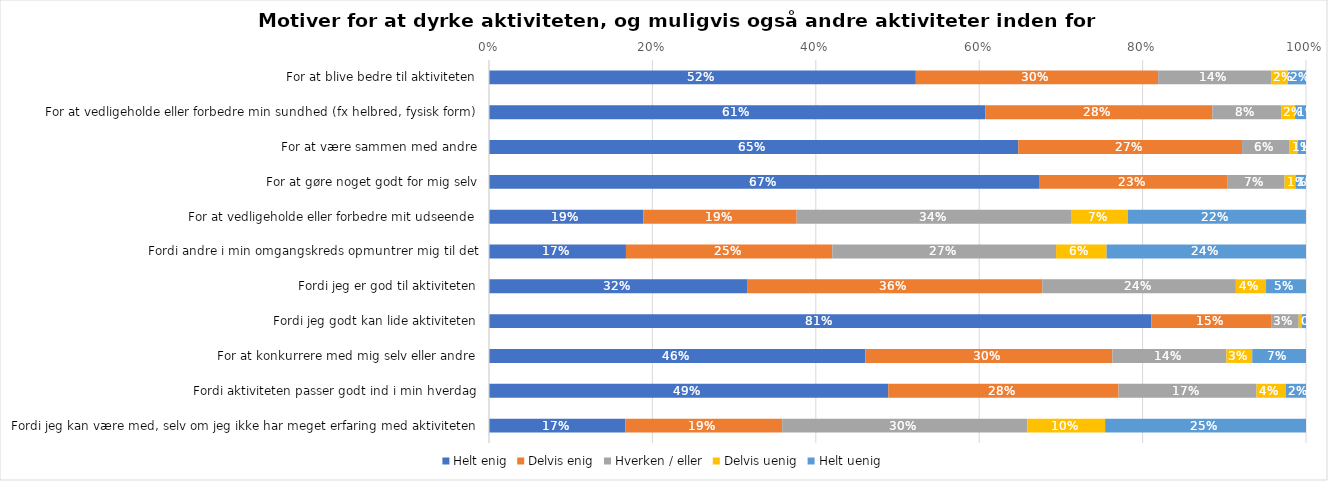
| Category | Helt enig | Delvis enig | Hverken / eller | Delvis uenig | Helt uenig |
|---|---|---|---|---|---|
| For at blive bedre til aktiviteten | 0.522 | 0.297 | 0.138 | 0.02 | 0.022 |
| For at vedligeholde eller forbedre min sundhed (fx helbred, fysisk form) | 0.607 | 0.278 | 0.084 | 0.017 | 0.013 |
| For at være sammen med andre | 0.648 | 0.274 | 0.058 | 0.01 | 0.01 |
| For at gøre noget godt for mig selv | 0.674 | 0.229 | 0.07 | 0.013 | 0.013 |
| For at vedligeholde eller forbedre mit udseende | 0.189 | 0.188 | 0.337 | 0.069 | 0.218 |
| Fordi andre i min omgangskreds opmuntrer mig til det | 0.168 | 0.253 | 0.274 | 0.062 | 0.244 |
| Fordi jeg er god til aktiviteten | 0.317 | 0.361 | 0.237 | 0.037 | 0.049 |
| Fordi jeg godt kan lide aktiviteten | 0.811 | 0.147 | 0.034 | 0.004 | 0.005 |
| For at konkurrere med mig selv eller andre | 0.461 | 0.302 | 0.14 | 0.032 | 0.066 |
| Fordi aktiviteten passer godt ind i min hverdag | 0.489 | 0.282 | 0.169 | 0.036 | 0.025 |
| Fordi jeg kan være med, selv om jeg ikke har meget erfaring med aktiviteten | 0.167 | 0.192 | 0.3 | 0.095 | 0.246 |